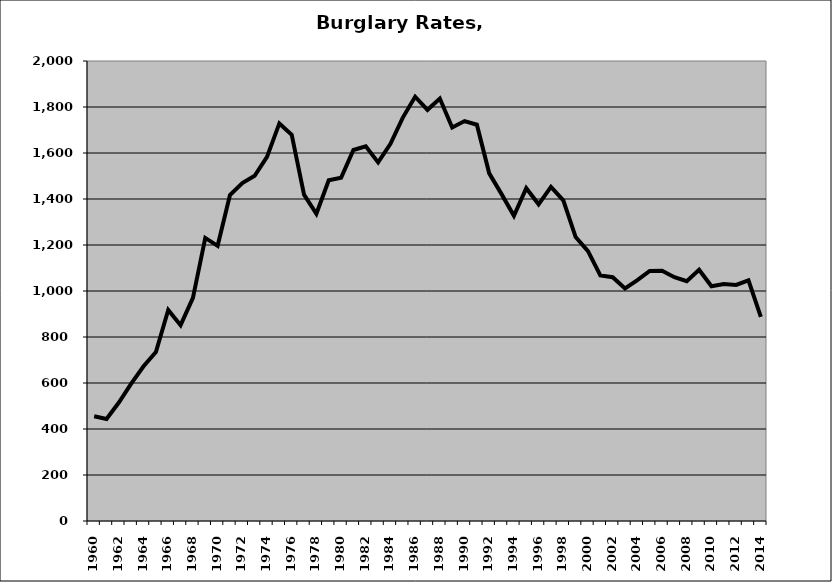
| Category | Burglary |
|---|---|
| 1960.0 | 455.404 |
| 1961.0 | 443.235 |
| 1962.0 | 515.294 |
| 1963.0 | 597.25 |
| 1964.0 | 672.817 |
| 1965.0 | 734.985 |
| 1966.0 | 917.808 |
| 1967.0 | 851.346 |
| 1968.0 | 970.246 |
| 1969.0 | 1230.785 |
| 1970.0 | 1196.457 |
| 1971.0 | 1417.087 |
| 1972.0 | 1469.484 |
| 1973.0 | 1500.995 |
| 1974.0 | 1583.066 |
| 1975.0 | 1728.684 |
| 1976.0 | 1679.538 |
| 1977.0 | 1418.655 |
| 1978.0 | 1335.644 |
| 1979.0 | 1481.467 |
| 1980.0 | 1492.504 |
| 1981.0 | 1613.037 |
| 1982.0 | 1628.771 |
| 1983.0 | 1559.185 |
| 1984.0 | 1639.677 |
| 1985.0 | 1753.931 |
| 1986.0 | 1844.692 |
| 1987.0 | 1787.667 |
| 1988.0 | 1836.887 |
| 1989.0 | 1711.126 |
| 1990.0 | 1738.733 |
| 1991.0 | 1722.997 |
| 1992.0 | 1511.448 |
| 1993.0 | 1421.163 |
| 1994.0 | 1326.784 |
| 1995.0 | 1447.062 |
| 1996.0 | 1376.883 |
| 1997.0 | 1452.37 |
| 1998.0 | 1393.955 |
| 1999.0 | 1234.651 |
| 2000.0 | 1173.087 |
| 2001.0 | 1067.87 |
| 2002.0 | 1060.126 |
| 2003.0 | 1011.252 |
| 2004.0 | 1046.975 |
| 2005.0 | 1087.184 |
| 2006.0 | 1088.1 |
| 2007.0 | 1060.046 |
| 2008.0 | 1042.902 |
| 2009.0 | 1092.467 |
| 2010.0 | 1020.504 |
| 2011.0 | 1030.417 |
| 2012.0 | 1026.33 |
| 2013.0 | 1045.956 |
| 2014.0 | 887.287 |